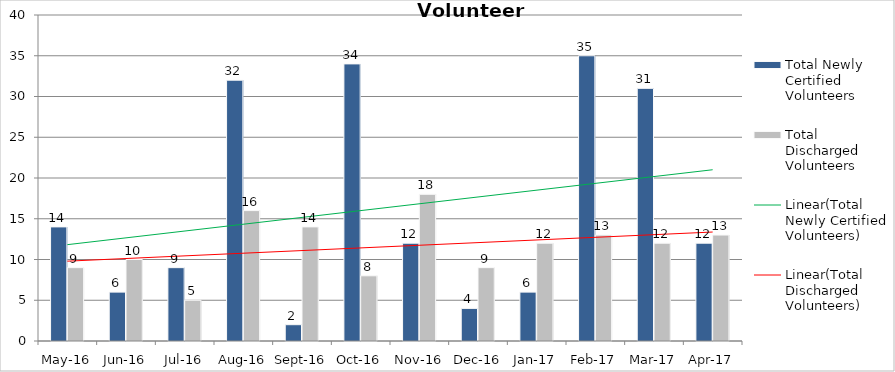
| Category | Total Newly Certified Volunteers | Total Discharged Volunteers |
|---|---|---|
| May-16 | 14 | 9 |
| Jun-16 | 6 | 10 |
| Jul-16 | 9 | 5 |
| Aug-16 | 32 | 16 |
| Sep-16 | 2 | 14 |
| Oct-16 | 34 | 8 |
| Nov-16 | 12 | 18 |
| Dec-16 | 4 | 9 |
| Jan-17 | 6 | 12 |
| Feb-17 | 35 | 13 |
| Mar-17 | 31 | 12 |
| Apr-17 | 12 | 13 |